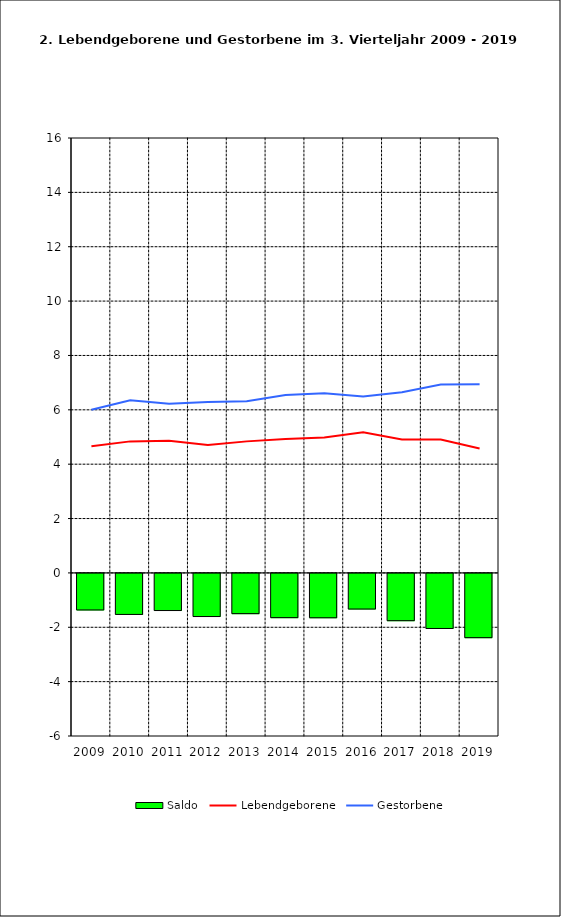
| Category | Saldo |
|---|---|
| 2009.0 | -1.345 |
| 2010.0 | -1.509 |
| 2011.0 | -1.366 |
| 2012.0 | -1.587 |
| 2013.0 | -1.48 |
| 2014.0 | -1.627 |
| 2015.0 | -1.632 |
| 2016.0 | -1.311 |
| 2017.0 | -1.739 |
| 2018.0 | -2.026 |
| 2019.0 | -2.364 |